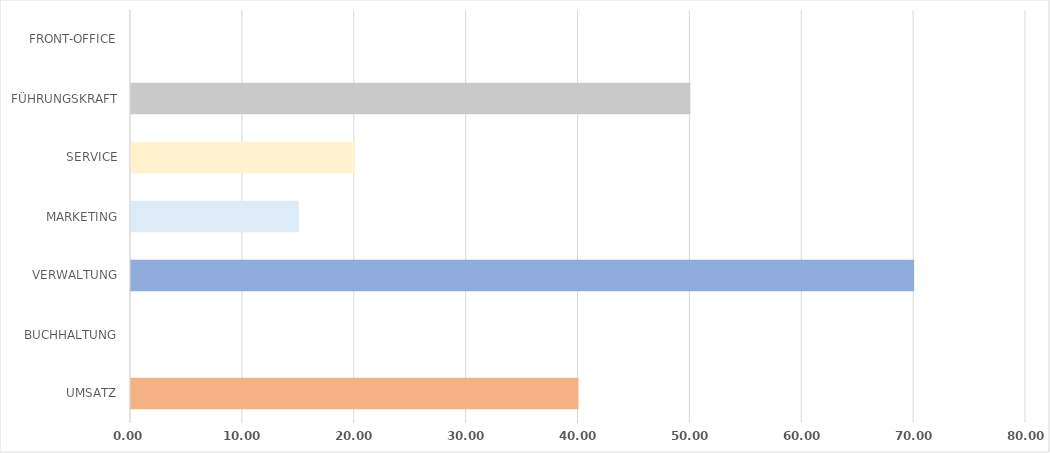
| Category | Series 0 |
|---|---|
| UMSATZ | 40 |
| BUCHHALTUNG | 0 |
| VERWALTUNG | 70 |
| MARKETING | 15 |
| SERVICE | 20 |
| FÜHRUNGSKRAFT | 50 |
| FRONT-OFFICE | 0 |